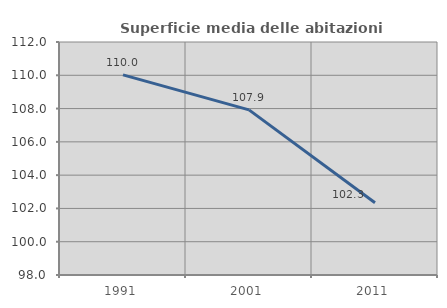
| Category | Superficie media delle abitazioni occupate |
|---|---|
| 1991.0 | 110.028 |
| 2001.0 | 107.923 |
| 2011.0 | 102.34 |